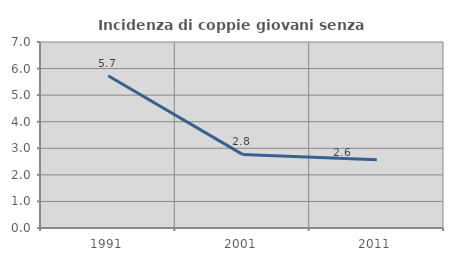
| Category | Incidenza di coppie giovani senza figli |
|---|---|
| 1991.0 | 5.732 |
| 2001.0 | 2.769 |
| 2011.0 | 2.571 |